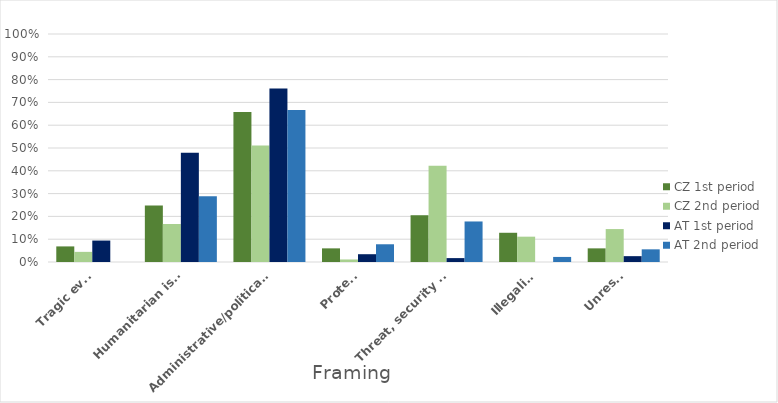
| Category | CZ 1st period | CZ 2nd period | AT 1st period | AT 2nd period |
|---|---|---|---|---|
| Tragic event | 0.068 | 0.044 | 0.094 | 0 |
| Humanitarian issue | 0.248 | 0.167 | 0.479 | 0.289 |
| Administrative/political issue | 0.658 | 0.511 | 0.761 | 0.667 |
| Protests | 0.06 | 0.011 | 0.034 | 0.078 |
| Threat, security risk | 0.205 | 0.422 | 0.017 | 0.178 |
| Illegality | 0.128 | 0.111 | 0 | 0.022 |
| Unrests | 0.06 | 0.144 | 0.026 | 0.056 |